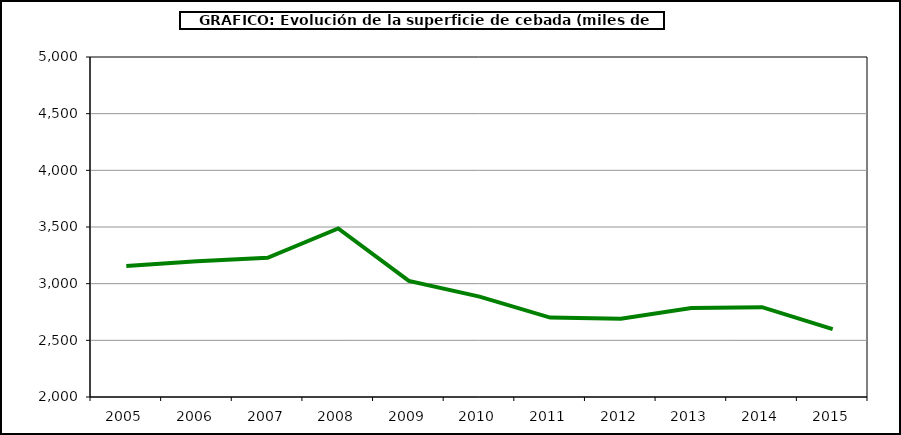
| Category | Superficie |
|---|---|
| 2005.0 | 3156.123 |
| 2006.0 | 3197.365 |
| 2007.0 | 3228.357 |
| 2008.0 | 3486.935 |
| 2009.0 | 3024.726 |
| 2010.0 | 2885.612 |
| 2011.0 | 2700.679 |
| 2012.0 | 2691.086 |
| 2013.0 | 2784.281 |
| 2014.0 | 2792.226 |
| 2015.0 | 2598.896 |